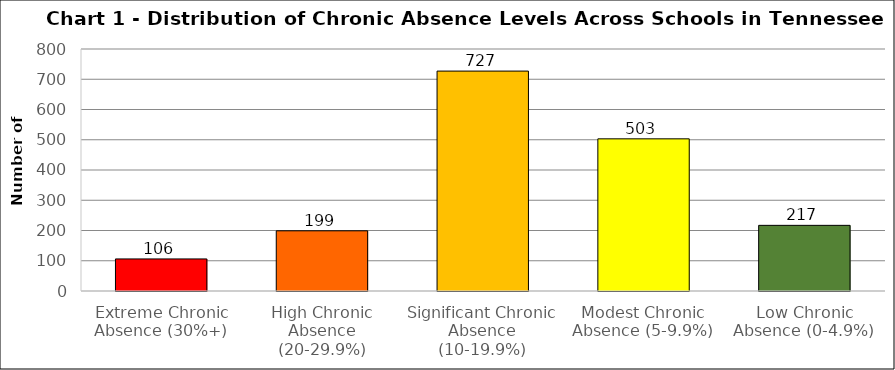
| Category | Series 0 |
|---|---|
| Extreme Chronic Absence (30%+) | 106 |
| High Chronic Absence (20-29.9%) | 199 |
| Significant Chronic Absence (10-19.9%) | 727 |
| Modest Chronic Absence (5-9.9%) | 503 |
| Low Chronic Absence (0-4.9%) | 217 |